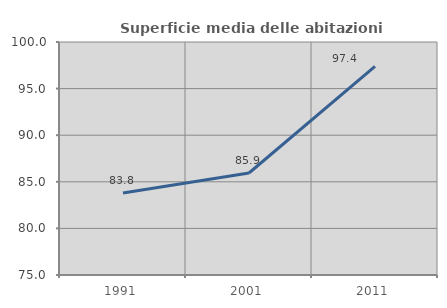
| Category | Superficie media delle abitazioni occupate |
|---|---|
| 1991.0 | 83.802 |
| 2001.0 | 85.945 |
| 2011.0 | 97.394 |